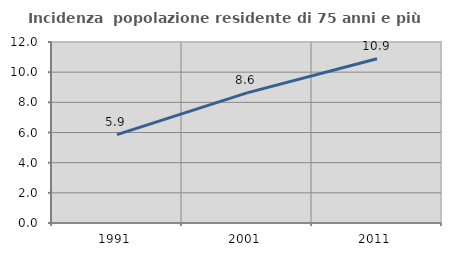
| Category | Incidenza  popolazione residente di 75 anni e più |
|---|---|
| 1991.0 | 5.858 |
| 2001.0 | 8.627 |
| 2011.0 | 10.889 |